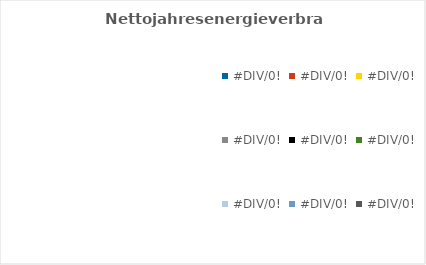
| Category | Nettojahresenergie-verbrauch [kWh/a] |
|---|---|
| 0.0 | 0 |
| 0.0 | 0 |
| 0.0 | 0 |
| 0.0 | 0 |
| 0.0 | 0 |
| 0.0 | 0 |
| 0.0 | 0 |
| 0.0 | 0 |
| 0.0 | 0 |